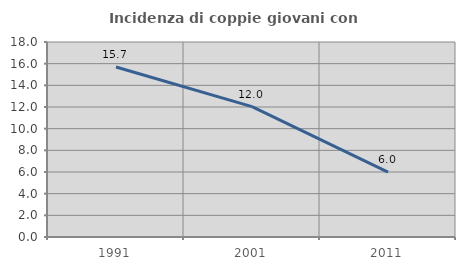
| Category | Incidenza di coppie giovani con figli |
|---|---|
| 1991.0 | 15.697 |
| 2001.0 | 12.03 |
| 2011.0 | 5.983 |